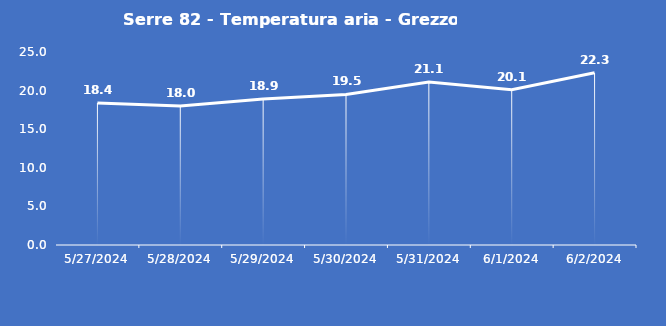
| Category | Serre 82 - Temperatura aria - Grezzo (°C) |
|---|---|
| 5/27/24 | 18.4 |
| 5/28/24 | 18 |
| 5/29/24 | 18.9 |
| 5/30/24 | 19.5 |
| 5/31/24 | 21.1 |
| 6/1/24 | 20.1 |
| 6/2/24 | 22.3 |